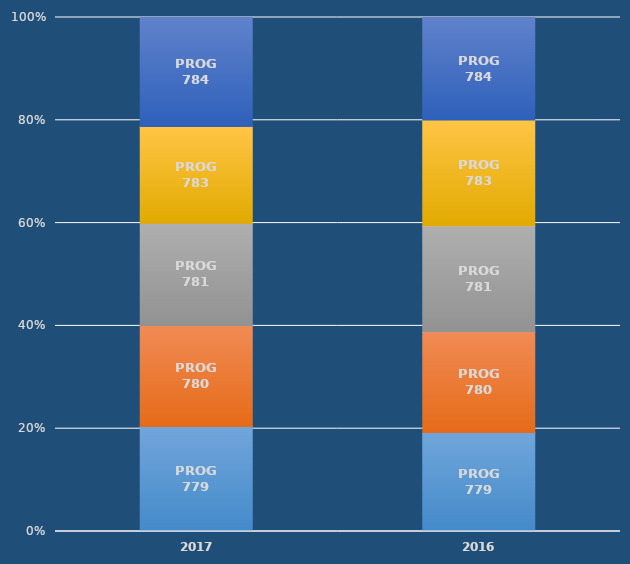
| Category | PROG 779 | PROG 780 | PROG 781 | PROG 783 | PROG 784 |
|---|---|---|---|---|---|
| 2017.0 | 0.892 | 0.857 | 0.866 | 0.821 | 0.926 |
| 2016.0 | 0.885 | 0.899 | 0.947 | 0.943 | 0.916 |